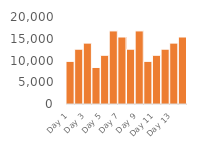
| Category | Projected Customer Demand |
|---|---|
| Day 1 | 9800 |
| Day 2 | 12600 |
| Day 3 | 14000 |
| Day 4 | 8400 |
| Day 5 | 11200 |
| Day 6 | 16800 |
| Day 7 | 15400 |
| Day 8 | 12600 |
| Day 9 | 16800 |
| Day 10 | 9800 |
| Day 11 | 11200 |
| Day 12 | 12600 |
| Day 13 | 14000 |
| Day 14 | 15400 |